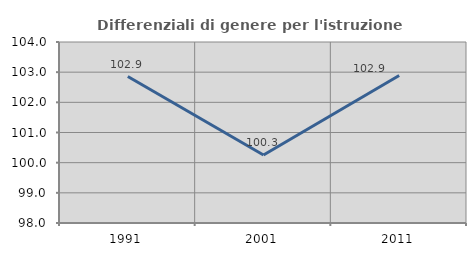
| Category | Differenziali di genere per l'istruzione superiore |
|---|---|
| 1991.0 | 102.855 |
| 2001.0 | 100.252 |
| 2011.0 | 102.889 |